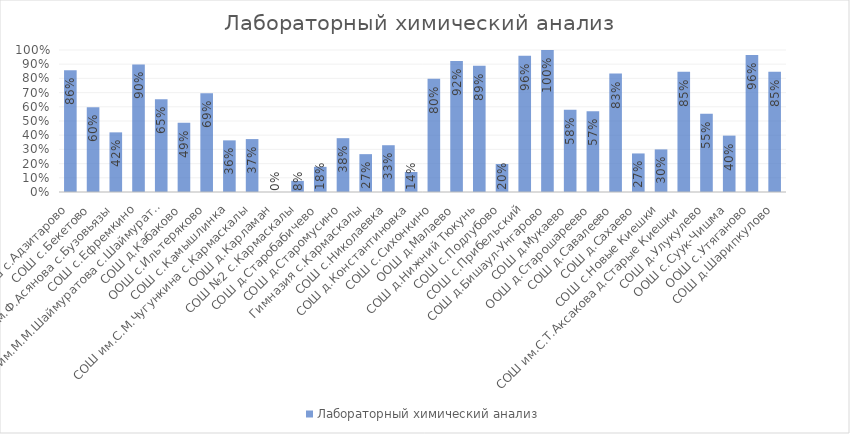
| Category | Лабораторный химический анализ |
|---|---|
| СОШ с.Адзитарово | 0.857 |
| СОШ с.Бекетово | 0.598 |
| СОШ им.Ф.Асянова с.Бузовьязы | 0.42 |
| СОШ с.Ефремкино | 0.899 |
| СОШ им.М.М.Шаймуратова с.Шаймуратово | 0.653 |
| СОШ д.Кабаково | 0.487 |
| ООШ с.Ильтеряково | 0.695 |
| СОШ с.Камышлинка | 0.364 |
| СОШ им.С.М.Чугункина с.Кармаскалы | 0.373 |
| ООШ д.Карламан | 0 |
| СОШ №2 с.Кармаскалы | 0.079 |
| СОШ д.Старобабичево | 0.177 |
| СОШ д.Старомусино | 0.379 |
| Гимназия с.Кармаскалы | 0.267 |
| СОШ с.Николаевка | 0.329 |
| СОШ д.Константиновка | 0.141 |
| СОШ с.Сихонкино | 0.798 |
| ООШ д.Малаево | 0.923 |
| СОШ д.Нижний Тюкунь | 0.889 |
| СОШ с.Подлубово | 0.197 |
| СОШ с.Прибельский | 0.959 |
| СОШ д.Бишаул-Унгарово | 1 |
| СОШ д.Мукаево | 0.579 |
| ООШ д.Старошареево | 0.568 |
| СОШ д.Савалеево | 0.834 |
| СОШ д.Сахаево | 0.271 |
| СОШ с.Новые Киешки | 0.3 |
| СОШ им.С.Т.Аксакова д.Старые Киешки | 0.847 |
| СОШ д.Улукулево | 0.551 |
| ООШ с.Суук-Чишма | 0.397 |
| ООШ с.Утяганово | 0.964 |
| СОШ д.Шарипкулово | 0.846 |